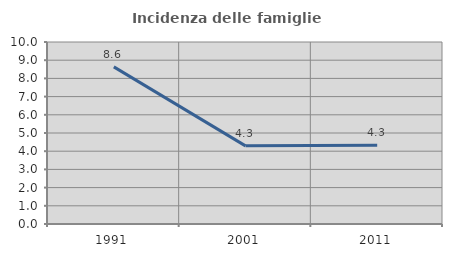
| Category | Incidenza delle famiglie numerose |
|---|---|
| 1991.0 | 8.633 |
| 2001.0 | 4.293 |
| 2011.0 | 4.326 |